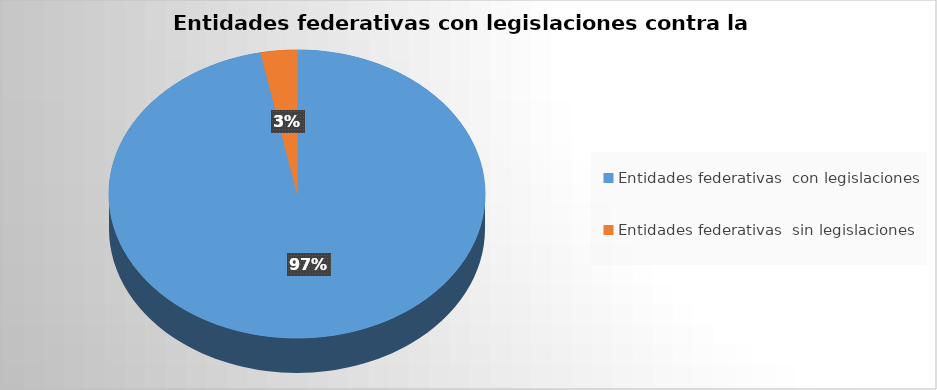
| Category | Series 0 |
|---|---|
| Entidades federativas  con legislaciones  | 31 |
| Entidades federativas  sin legislaciones  | 1 |